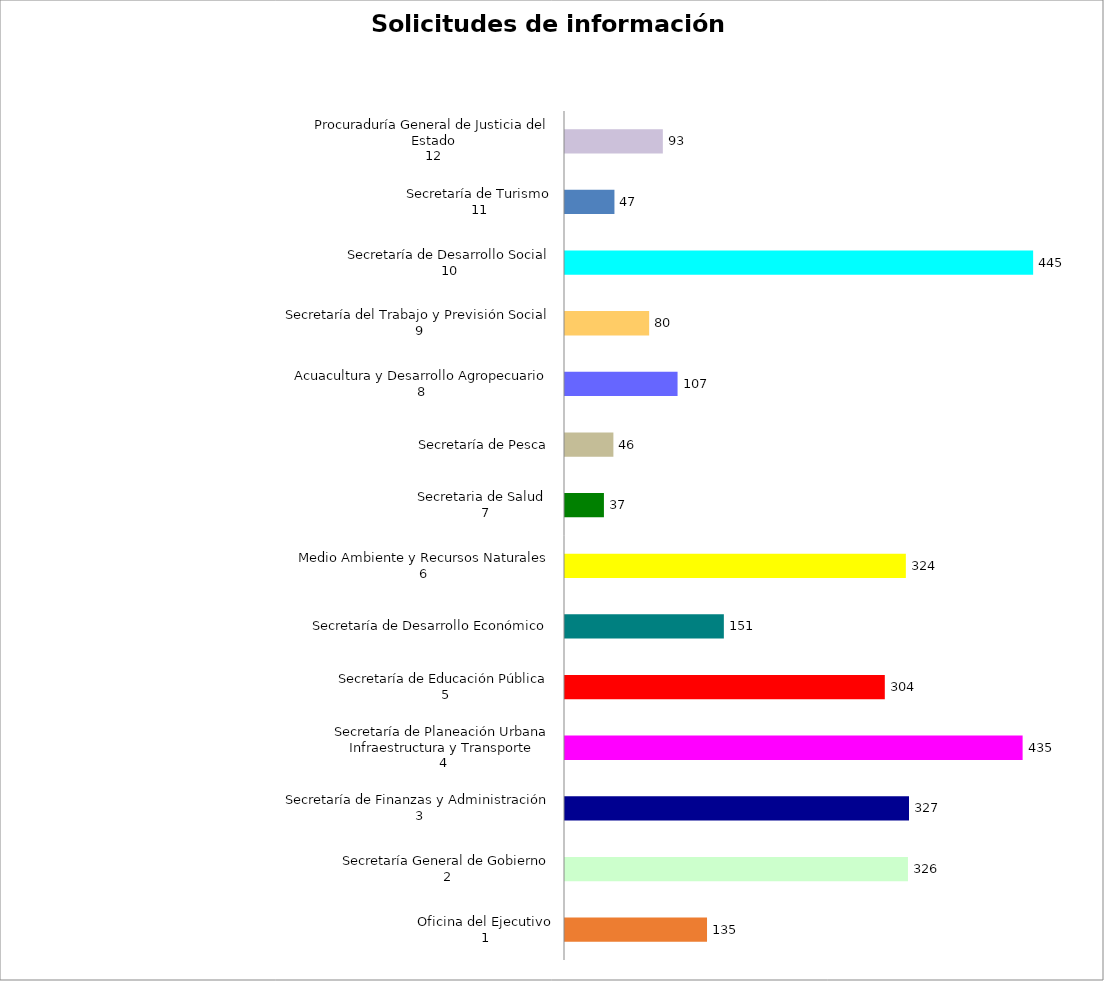
| Category | Series 0 |
|---|---|
| 0 | 135 |
| 1 | 326 |
| 2 | 327 |
| 3 | 435 |
| 4 | 304 |
| 5 | 151 |
| 6 | 324 |
| 7 | 37 |
| 8 | 46 |
| 9 | 107 |
| 10 | 80 |
| 11 | 445 |
| 12 | 47 |
| 13 | 93 |